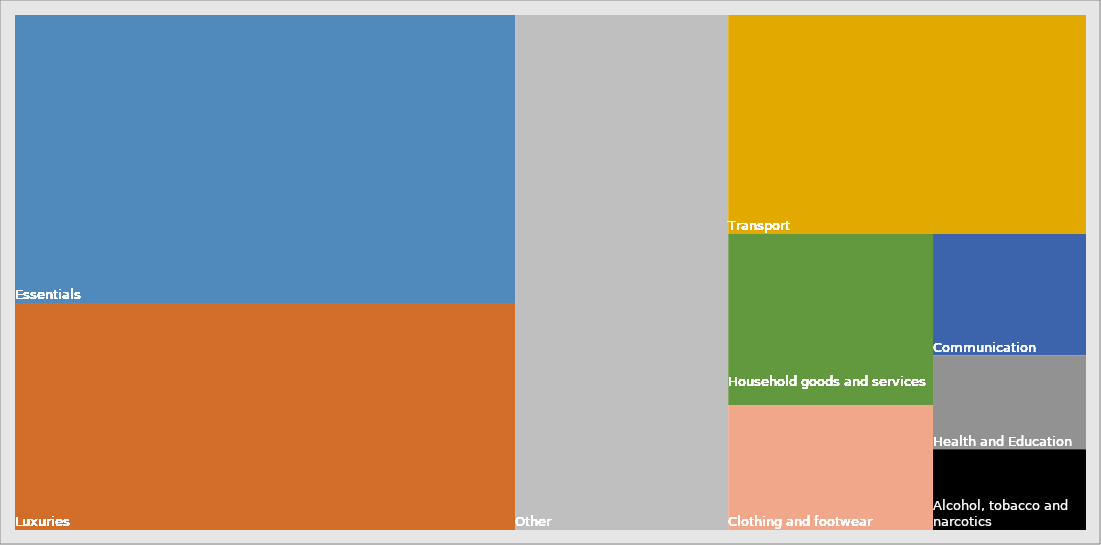
| Category | Decile 4 | CPIH |
|---|---|---|
| 2008-01-01 | 2.5 | 2.4 |
| 2008-02-01 | 2.9 | 2.6 |
| 2008-03-01 | 2.9 | 2.6 |
| 2008-04-01 | 3.3 | 3 |
| 2008-05-01 | 3.7 | 3.3 |
| 2008-06-01 | 4.2 | 3.7 |
| 2008-07-01 | 4.6 | 4.2 |
| 2008-08-01 | 5 | 4.4 |
| 2008-09-01 | 5.6 | 4.8 |
| 2008-10-01 | 5.1 | 4.2 |
| 2008-11-01 | 4.9 | 3.8 |
| 2008-12-01 | 4.1 | 3 |
| 2009-01-01 | 4.2 | 2.9 |
| 2009-02-01 | 4.1 | 3.1 |
| 2009-03-01 | 3.8 | 2.8 |
| 2009-04-01 | 3 | 2.3 |
| 2009-05-01 | 2.8 | 2.1 |
| 2009-06-01 | 2.3 | 1.7 |
| 2009-07-01 | 2.2 | 1.6 |
| 2009-08-01 | 1.7 | 1.4 |
| 2009-09-01 | 1 | 1 |
| 2009-10-01 | 1.2 | 1.2 |
| 2009-11-01 | 1.3 | 1.5 |
| 2009-12-01 | 1.7 | 2.1 |
| 2010-01-01 | 2 | 2.6 |
| 2010-02-01 | 1.5 | 2.1 |
| 2010-03-01 | 1.9 | 2.4 |
| 2010-04-01 | 2.1 | 2.7 |
| 2010-05-01 | 1.9 | 2.5 |
| 2010-06-01 | 1.9 | 2.4 |
| 2010-07-01 | 1.9 | 2.3 |
| 2010-08-01 | 2.1 | 2.4 |
| 2010-09-01 | 2 | 2.4 |
| 2010-10-01 | 2.2 | 2.5 |
| 2010-11-01 | 2.3 | 2.6 |
| 2010-12-01 | 3 | 3.1 |
| 2011-01-01 | 3.3 | 3.4 |
| 2011-02-01 | 3.7 | 3.7 |
| 2011-03-01 | 3.5 | 3.5 |
| 2011-04-01 | 3.8 | 3.8 |
| 2011-05-01 | 4 | 3.8 |
| 2011-06-01 | 3.9 | 3.6 |
| 2011-07-01 | 4 | 3.8 |
| 2011-08-01 | 4.1 | 3.9 |
| 2011-09-01 | 4.9 | 4.5 |
| 2011-10-01 | 4.7 | 4.3 |
| 2011-11-01 | 4.6 | 4.1 |
| 2011-12-01 | 4.1 | 3.7 |
| 2012-01-01 | 3.5 | 3.2 |
| 2012-02-01 | 3.4 | 3.1 |
| 2012-03-01 | 3.4 | 3.1 |
| 2012-04-01 | 3.1 | 2.8 |
| 2012-05-01 | 2.8 | 2.5 |
| 2012-06-01 | 2.5 | 2.3 |
| 2012-07-01 | 2.6 | 2.4 |
| 2012-08-01 | 2.5 | 2.3 |
| 2012-09-01 | 2.1 | 2.1 |
| 2012-10-01 | 2.3 | 2.4 |
| 2012-11-01 | 2.3 | 2.4 |
| 2012-12-01 | 2.5 | 2.4 |
| 2013-01-01 | 2.4 | 2.4 |
| 2013-02-01 | 2.6 | 2.5 |
| 2013-03-01 | 2.6 | 2.5 |
| 2013-04-01 | 2.3 | 2.2 |
| 2013-05-01 | 2.5 | 2.4 |
| 2013-06-01 | 2.7 | 2.6 |
| 2013-07-01 | 2.5 | 2.5 |
| 2013-08-01 | 2.5 | 2.4 |
| 2013-09-01 | 2.5 | 2.4 |
| 2013-10-01 | 2.2 | 2 |
| 2013-11-01 | 2 | 1.9 |
| 2013-12-01 | 2 | 1.9 |
| 2014-01-01 | 2 | 1.8 |
| 2014-02-01 | 1.8 | 1.6 |
| 2014-03-01 | 1.7 | 1.5 |
| 2014-04-01 | 1.7 | 1.7 |
| 2014-05-01 | 1.5 | 1.5 |
| 2014-06-01 | 1.7 | 1.8 |
| 2014-07-01 | 1.5 | 1.6 |
| 2014-08-01 | 1.4 | 1.5 |
| 2014-09-01 | 1.2 | 1.3 |
| 2014-10-01 | 1.3 | 1.3 |
| 2014-11-01 | 1.1 | 1.1 |
| 2014-12-01 | 0.6 | 0.7 |
| 2015-01-01 | 0.4 | 0.5 |
| 2015-02-01 | 0.2 | 0.4 |
| 2015-03-01 | 0.2 | 0.3 |
| 2015-04-01 | 0.2 | 0.3 |
| 2015-05-01 | 0.4 | 0.4 |
| 2015-06-01 | 0.2 | 0.3 |
| 2015-07-01 | 0.4 | 0.5 |
| 2015-08-01 | 0.3 | 0.4 |
| 2015-09-01 | 0.1 | 0.2 |
| 2015-10-01 | 0.1 | 0.2 |
| 2015-11-01 | 0.3 | 0.4 |
| 2015-12-01 | 0.4 | 0.5 |
| 2016-01-01 | 0.6 | 0.6 |
| 2016-02-01 | 0.6 | 0.6 |
| 2016-03-01 | 0.6 | 0.8 |
| 2016-04-01 | 0.6 | 0.7 |
| 2016-05-01 | 0.7 | 0.7 |
| 2016-06-01 | 0.8 | 0.8 |
| 2016-07-01 | 0.8 | 0.9 |
| 2016-08-01 | 0.8 | 1 |
| 2016-09-01 | 1.1 | 1.3 |
| 2016-10-01 | 1.2 | 1.3 |
| 2016-11-01 | 1.4 | 1.5 |
| 2016-12-01 | 1.6 | 1.8 |
| 2017-01-01 | 1.8 | 1.9 |
| 2017-02-01 | 2.1 | 2.3 |
| 2017-03-01 | 2.3 | 2.3 |
| 2017-04-01 | 2.5 | 2.6 |
| 2017-05-01 | 2.6 | 2.7 |
| 2017-06-01 | 2.5 | 2.6 |
| 2017-07-01 | 2.5 | 2.6 |
| 2017-08-01 | 2.7 | 2.7 |
| 2017-09-01 | 2.8 | 2.8 |
| 2017-10-01 | 2.7 | 2.8 |
| 2017-11-01 | 2.7 | 2.8 |
| 2017-12-01 | 2.7 | 2.7 |
| 2018-01-01 | 2.6 | 2.7 |
| 2018-02-01 | 2.4 | 2.5 |
| 2018-03-01 | 2.2 | 2.3 |